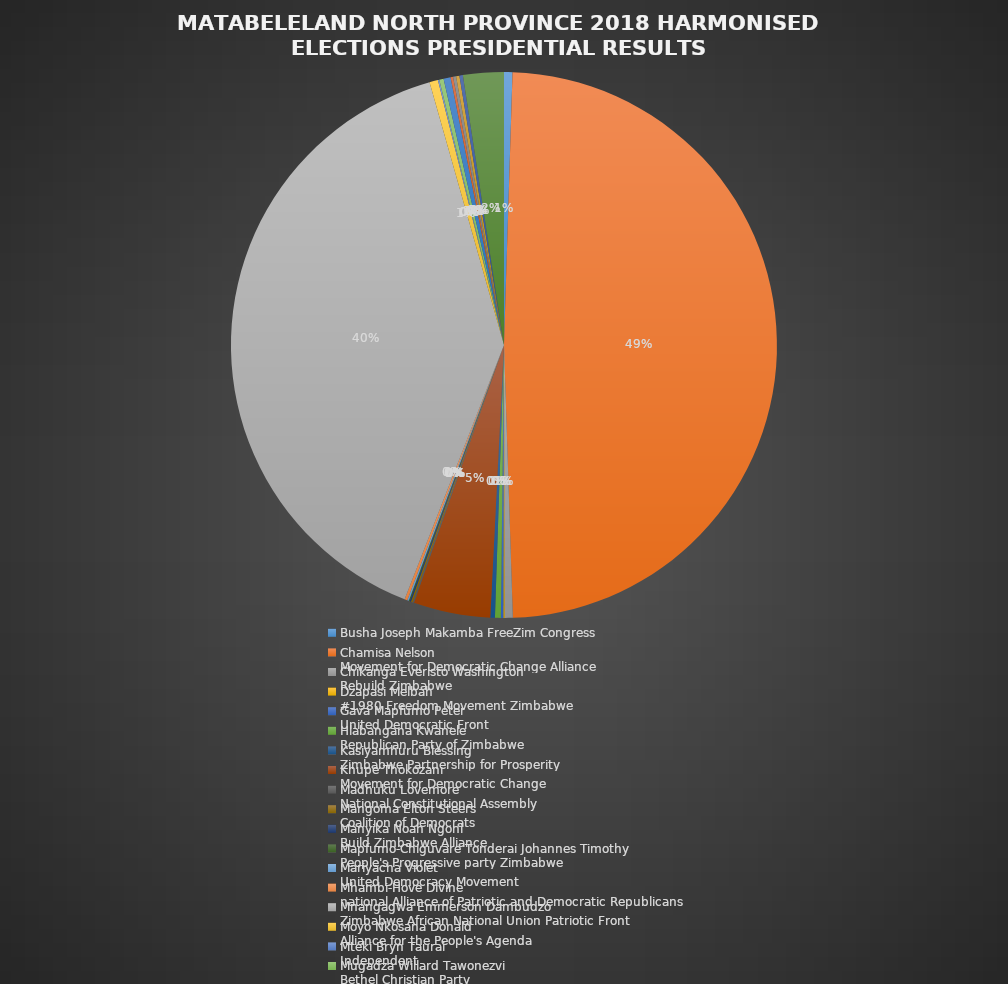
| Category | Series 0 |
|---|---|
| Busha Joseph Makamba FreeZim Congress | 1401 |
| Chamisa Nelson
Movement for Democratic Change Alliance | 137611 |
| Chikanga Everisto Washington
Rebuild Zimbabwe | 1342 |
| Dzapasi Melbah
#1980 Freedom Movement Zimbabwe | 221 |
| Gava Mapfumo Peter
United Democratic Front | 404 |
| Hlabangana Kwanele
Republican Party of Zimbabwe | 975 |
| Kasiyamhuru Blessing
Zimbabwe Partnership for Prosperity | 765 |
| Khupe Thokozani
Movement for Democratic Change | 12776 |
| Madhuku Lovemore
National Constitutional Assembly | 261 |
| Mangoma Elton Steers
Coalition of Democrats | 264 |
| Manyika Noah Ngoni
Build Zimbabwe Alliance | 227 |
| Mapfumo-Chiguvare Tonderai Johannes Timothy
People's Progressive party Zimbabwe | 148 |
| Mariyacha Violet
United Democracy Movement | 267 |
| Mhambi-Hove Divine
national Alliance of Patriotic and Democratic Republicans | 462 |
| Mnangagwa Emmerson Dambudzo
Zimbabwe African National Union Patriotic Front | 111452 |
| Moyo Nkosana Donald
Alliance for the People's Agenda | 1419 |
| Mteki Bryn Taurai
Independent | 229 |
| Mugadza Willard Tawonezvi
Bethel Christian Party | 726 |
| Mujuru Joice Teurai Ropa
People's Rainbow Coalition | 1170 |
| Munyanduri Tendai Peter
New Patriotic Front | 412 |
| Mutinhiri Ambrose
National Patriotic Front | 502 |
| Shumba Kuzozvirava Daniel
United Democratic Alliance | 558 |
| Wilson Harry Peter
Democratic Opposition Party | 570 |
| Total Votes Rejected  | 6767 |